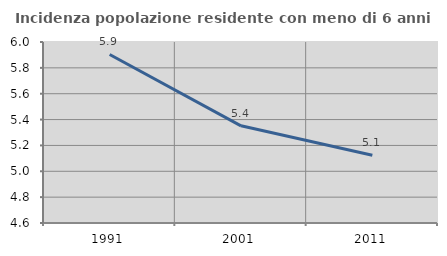
| Category | Incidenza popolazione residente con meno di 6 anni |
|---|---|
| 1991.0 | 5.903 |
| 2001.0 | 5.352 |
| 2011.0 | 5.124 |